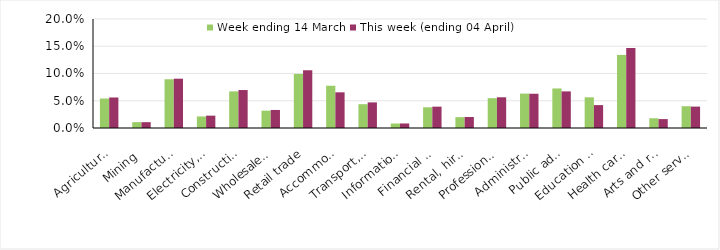
| Category | Week ending 14 March | This week (ending 04 April) |
|---|---|---|
| Agriculture, forestry and fishing | 0.054 | 0.056 |
| Mining | 0.011 | 0.011 |
| Manufacturing | 0.089 | 0.09 |
| Electricity, gas, water and waste services | 0.021 | 0.023 |
| Construction | 0.067 | 0.07 |
| Wholesale trade | 0.032 | 0.033 |
| Retail trade | 0.099 | 0.106 |
| Accommodation and food services | 0.078 | 0.065 |
| Transport, postal and warehousing | 0.044 | 0.047 |
| Information media and telecommunications | 0.008 | 0.008 |
| Financial and insurance services | 0.038 | 0.039 |
| Rental, hiring and real estate services | 0.02 | 0.02 |
| Professional, scientific and technical services | 0.055 | 0.056 |
| Administrative and support services | 0.063 | 0.063 |
| Public administration and safety | 0.073 | 0.067 |
| Education and training | 0.056 | 0.042 |
| Health care and social assistance | 0.134 | 0.147 |
| Arts and recreation services | 0.018 | 0.016 |
| Other services | 0.04 | 0.039 |